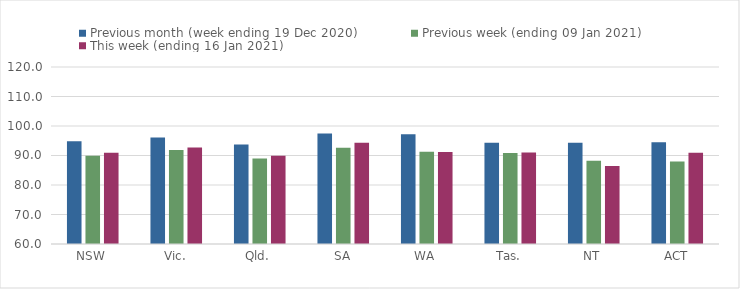
| Category | Previous month (week ending 19 Dec 2020) | Previous week (ending 09 Jan 2021) | This week (ending 16 Jan 2021) |
|---|---|---|---|
| NSW | 94.84 | 89.93 | 90.9 |
| Vic. | 96.12 | 91.86 | 92.71 |
| Qld. | 93.73 | 88.99 | 89.91 |
| SA | 97.48 | 92.64 | 94.3 |
| WA | 97.19 | 91.25 | 91.21 |
| Tas. | 94.35 | 90.84 | 91.04 |
| NT | 94.33 | 88.2 | 86.45 |
| ACT | 94.48 | 88 | 90.96 |